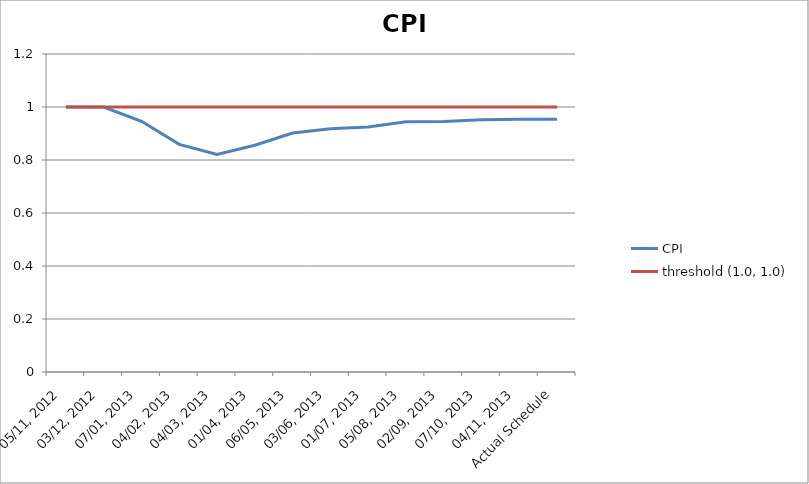
| Category | CPI | threshold (1.0, 1.0) |
|---|---|---|
| 05/11, 2012 | 1 | 1 |
| 03/12, 2012 | 1 | 1 |
| 07/01, 2013 | 0.946 | 1 |
| 04/02, 2013 | 0.859 | 1 |
| 04/03, 2013 | 0.821 | 1 |
| 01/04, 2013 | 0.856 | 1 |
| 06/05, 2013 | 0.902 | 1 |
| 03/06, 2013 | 0.918 | 1 |
| 01/07, 2013 | 0.924 | 1 |
| 05/08, 2013 | 0.945 | 1 |
| 02/09, 2013 | 0.946 | 1 |
| 07/10, 2013 | 0.952 | 1 |
| 04/11, 2013 | 0.954 | 1 |
| Actual Schedule | 0.954 | 1 |